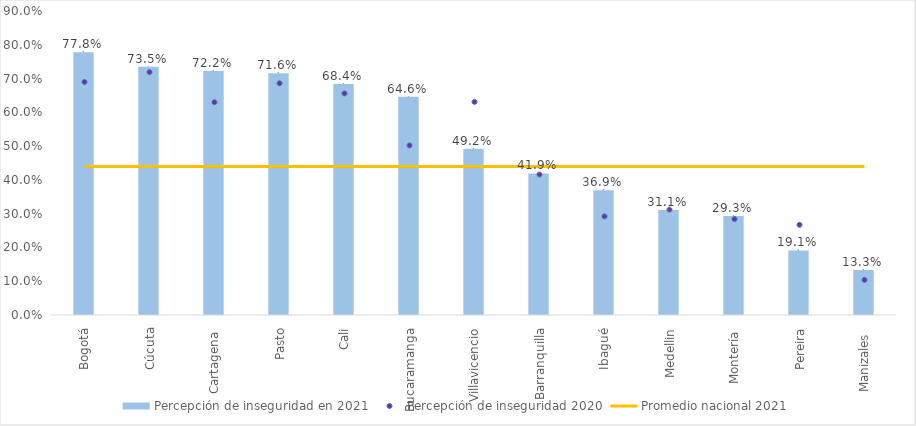
| Category | Percepción de inseguridad en 2021 |
|---|---|
| Bogotá | 0.778 |
| Cúcuta | 0.735 |
| Cartagena  | 0.722 |
| Pasto | 0.716 |
| Cali | 0.684 |
| Bucaramanga | 0.646 |
| Villavicencio | 0.492 |
| Barranquilla | 0.419 |
| Ibagué | 0.369 |
| Medellin | 0.311 |
| Montería  | 0.293 |
| Pereira | 0.191 |
| Manizales  | 0.133 |